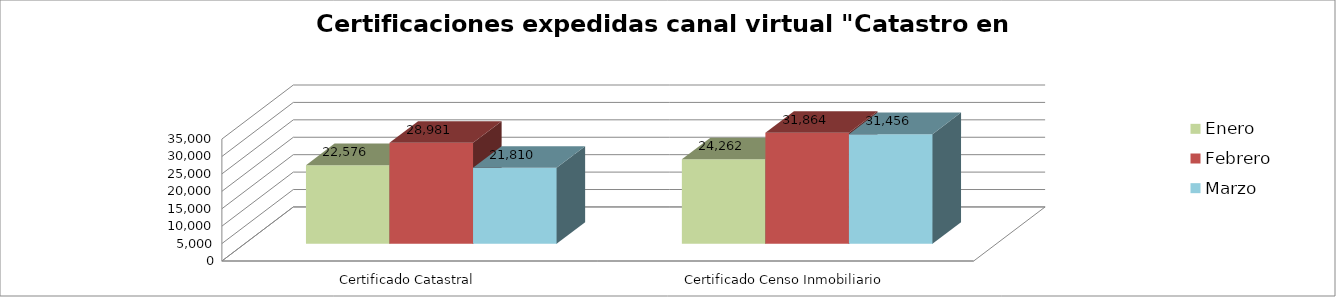
| Category | Enero | Febrero | Marzo |
|---|---|---|---|
| Certificado Catastral | 22576 | 28981 | 21810 |
| Certificado Censo Inmobiliario | 24262 | 31864 | 31456 |